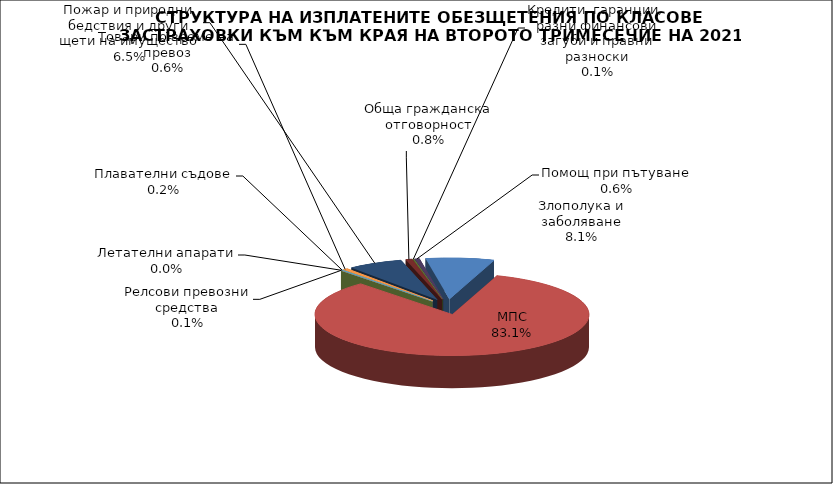
| Category | Злополука и заболяване |
|---|---|
| Злополука и заболяване | 0.081 |
| МПС | 0.831 |
| Релсови превозни средства | 0.001 |
| Летателни апарати | 0 |
| Плавателни съдове | 0.002 |
| Товари по време на превоз | 0.006 |
| Пожар и природни бедствия и други щети на имущество | 0.065 |
| Обща гражданска отговорност | 0.008 |
| Кредити, гаранции, разни финансови загуби и правни разноски | 0.001 |
| Помощ при пътуване | 0.006 |